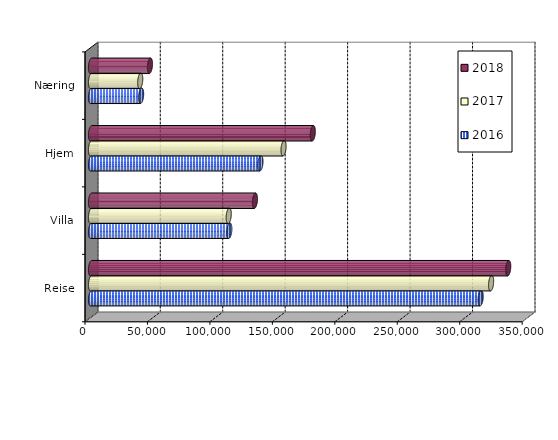
| Category | 2016 | 2017 | 2018 |
|---|---|---|---|
| Reise | 311962 | 320312 | 334023 |
| Villa | 110745.204 | 110274.261 | 131240.078 |
| Hjem | 135636.54 | 154164.243 | 177571.248 |
| Næring | 40113.599 | 39410.456 | 47206.097 |